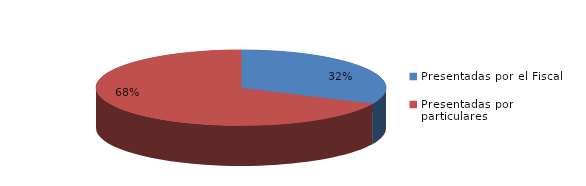
| Category | Series 0 |
|---|---|
| Presentadas por el Fiscal | 64 |
| Presentadas por particulares | 136 |